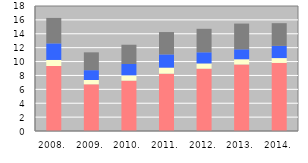
| Category | ЕУ | CEFTА | Русија | Остали |
|---|---|---|---|---|
| 2008. | 9359.095 | 873.217 | 2389.166 | 3661.546 |
| 2009. | 6724.038 | 622.074 | 1414.393 | 2566.53 |
| 2010. | 7249.853 | 766.721 | 1629.7 | 2777.18 |
| 2011. | 8257.482 | 867.659 | 1906.046 | 3218.858 |
| 2012. | 8974.142 | 755.485 | 1607.806 | 3379.31 |
| 2013. | 9581.254 | 752.294 | 1429.156 | 3706.319 |
| 2014. | 9802.463 | 699.218 | 1756.726 | 3267.878 |